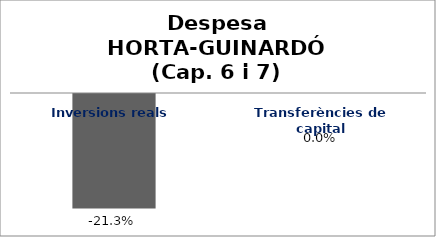
| Category | Series 0 |
|---|---|
| Inversions reals | -0.213 |
| Transferències de capital | 0 |